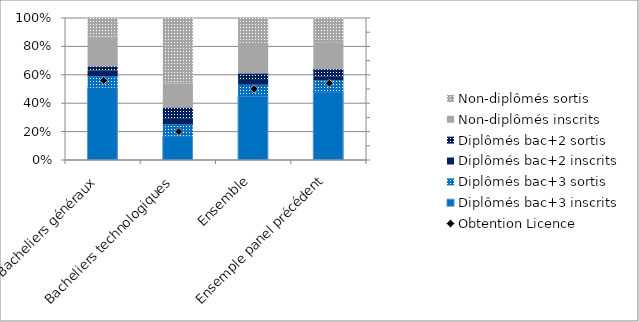
| Category | Diplômés bac+3 inscrits | Diplômés bac+3 sortis | Diplômés bac+2 inscrits | Diplômés bac+2 sortis | Non-diplômés inscrits | Non-diplômés sortis |
|---|---|---|---|---|---|---|
| Bacheliers généraux | 51 | 8 | 4 | 3 | 21 | 13 |
| Bacheliers technologiques | 17 | 8 | 4 | 8 | 17 | 46 |
| Ensemble | 45 | 8 | 4 | 4 | 20 | 19 |
| Ensemple panel précédent | 48 | 8 | 3 | 5 | 19 | 17 |